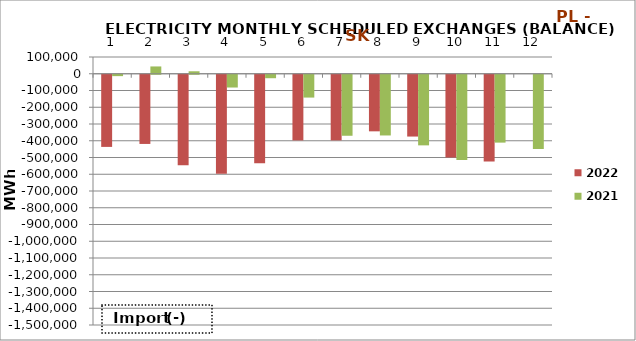
| Category | 2022 | 2021 |
|---|---|---|
| 0 | -430778.6 | -8244 |
| 1 | -413059.5 | 43608 |
| 2 | -539610.2 | 14765 |
| 3 | -590685.6 | -76243 |
| 4 | -528985.9 | -20686 |
| 5 | -392038.6 | -136261 |
| 6 | -391971.9 | -364245.6 |
| 7 | -337824.7 | -362502.7 |
| 8 | -368982.2 | -421565.4 |
| 9 | -494048.4 | -509271.7 |
| 10 | -518526.5 | -405207.7 |
| 11 | 0 | -443450.9 |